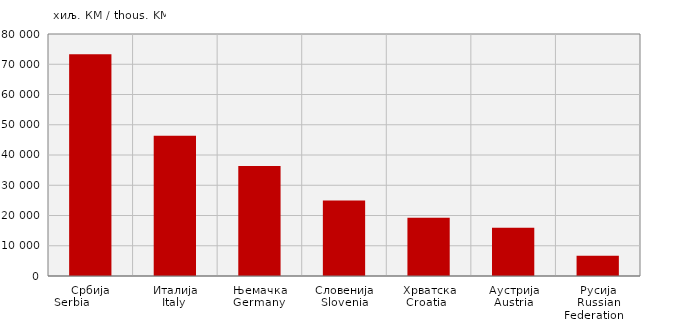
| Category | Увоз
Import |
|---|---|
| Србија
Serbia            | 73294.044 |
| Италија
Italy  | 46335.721 |
| Њемачка
Germany  | 36393.543 |
| Словенија
Slovenia | 24961.235 |
| Хрватска
Croatia   | 19235.085 |
| Аустрија
Austria | 15984.301 |
| Русија
Russian Federation    | 6700.123 |